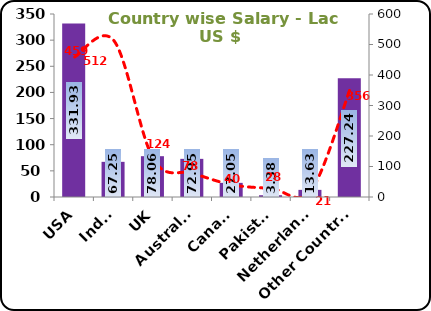
| Category | Series 0 |
|---|---|
| USA | 331.935 |
| India | 67.247 |
| UK | 78.055 |
| Australia | 72.95 |
| Canada | 27.047 |
| Pakistan | 3.38 |
| Netherlands | 13.625 |
| Other Countries | 227.241 |